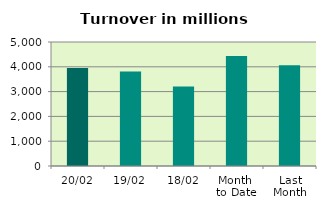
| Category | Series 0 |
|---|---|
| 20/02 | 3955.613 |
| 19/02 | 3813.73 |
| 18/02 | 3209.775 |
| Month 
to Date | 4430.963 |
| Last
Month | 4067.116 |